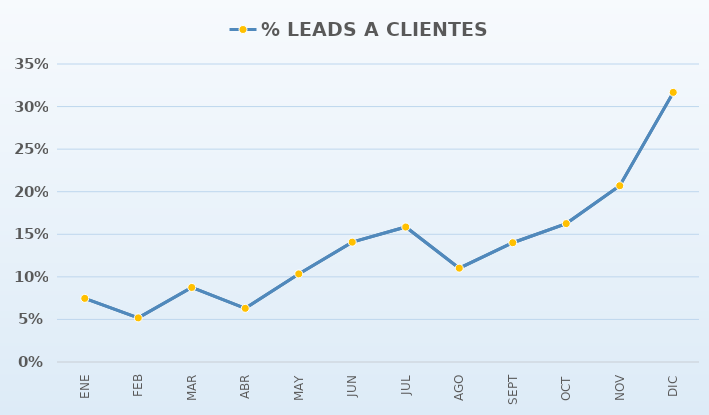
| Category | TASAS DE CONVERSIÓN | % LEADS A CLIENTES  |
|---|---|---|
| ENE |  | 0.075 |
| FEB |  | 0.052 |
| MAR |  | 0.088 |
| ABR |  | 0.063 |
| MAY |  | 0.103 |
| JUN |  | 0.141 |
| JUL |  | 0.159 |
| AGO |  | 0.11 |
| SEPT |  | 0.14 |
| OCT |  | 0.163 |
| NOV |  | 0.207 |
| DIC |  | 0.317 |